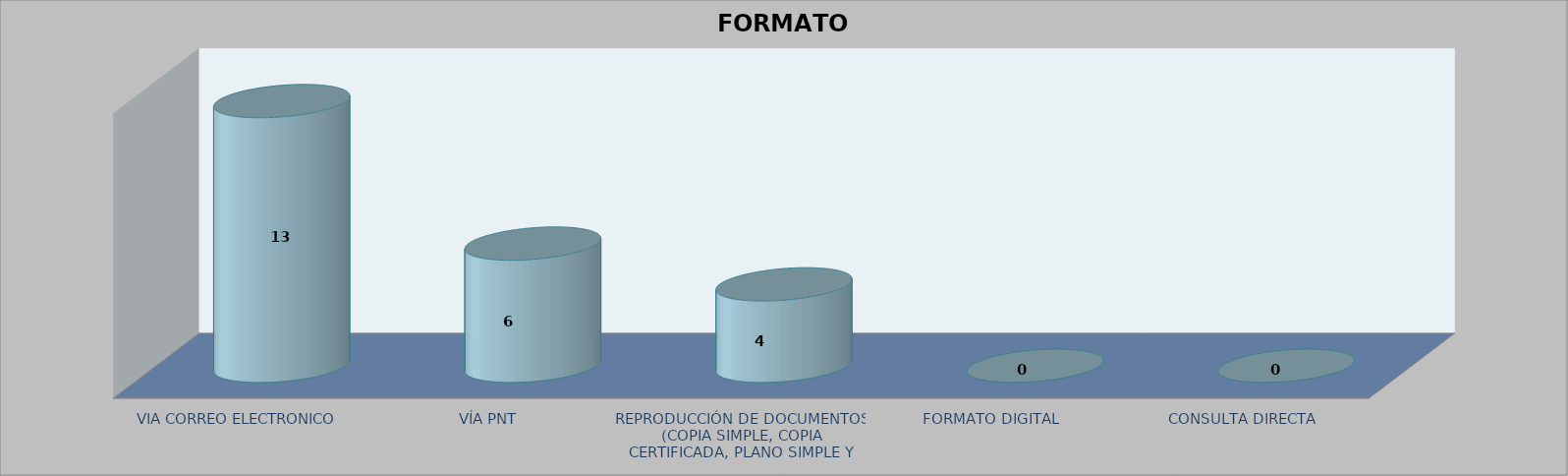
| Category |        FORMATO SOLICITADO | Series 1 | Series 2 |
|---|---|---|---|
| VIA CORREO ELECTRONICO |  |  | 13 |
| VÍA PNT |  |  | 6 |
| REPRODUCCIÓN DE DOCUMENTOS (COPIA SIMPLE, COPIA CERTIFICADA, PLANO SIMPLE Y PLANO CERTIFICADO) |  |  | 4 |
| FORMATO DIGITAL |  |  | 0 |
| CONSULTA DIRECTA |  |  | 0 |